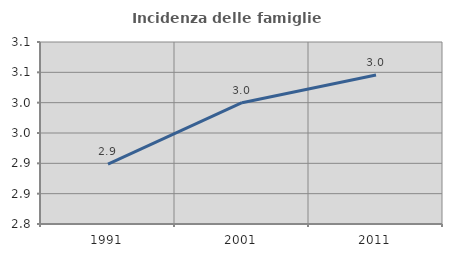
| Category | Incidenza delle famiglie numerose |
|---|---|
| 1991.0 | 2.899 |
| 2001.0 | 3 |
| 2011.0 | 3.046 |